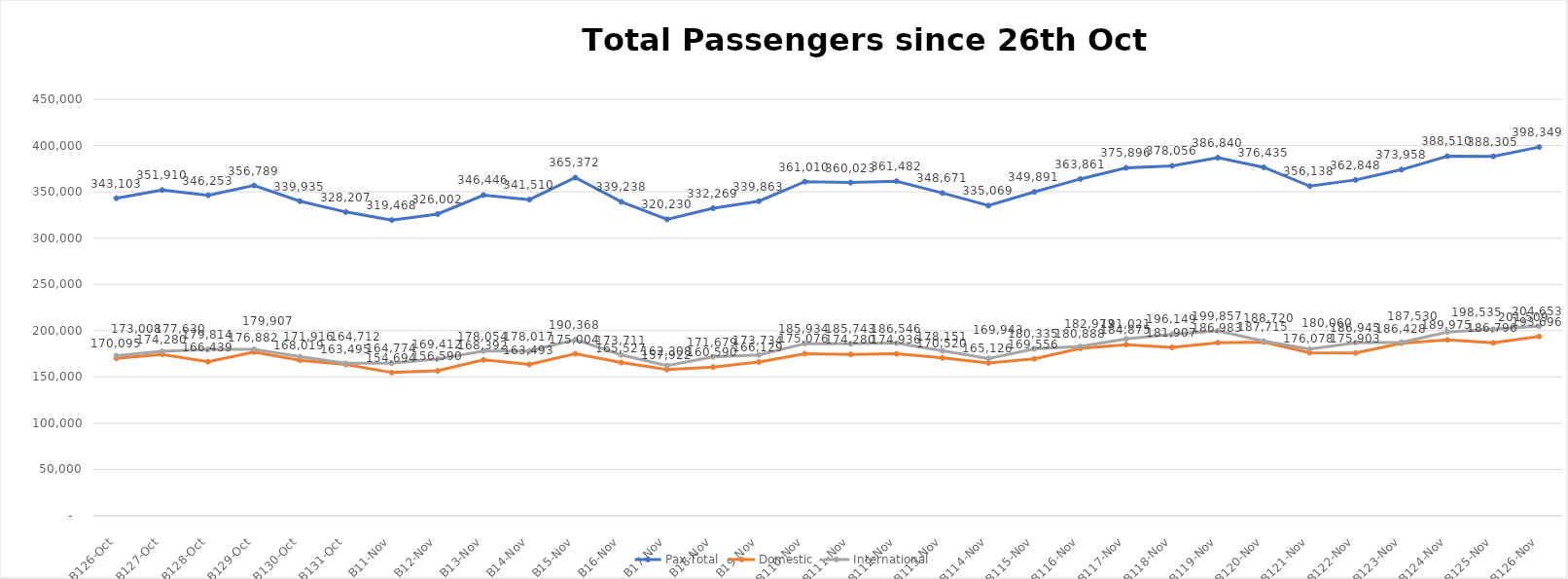
| Category | Pax Total | Domestic | International |
|---|---|---|---|
| 2023-10-26 | 343103 | 170095 | 173008 |
| 2023-10-27 | 351910 | 174280 | 177630 |
| 2023-10-28 | 346253 | 166439 | 179814 |
| 2023-10-29 | 356789 | 176882 | 179907 |
| 2023-10-30 | 339935 | 168019 | 171916 |
| 2023-10-31 | 328207 | 163495 | 164712 |
| 2023-11-01 | 319468 | 154694 | 164774 |
| 2023-11-02 | 326002 | 156590 | 169412 |
| 2023-11-03 | 346446 | 168392 | 178054 |
| 2023-11-04 | 341510 | 163493 | 178017 |
| 2023-11-05 | 365372 | 175004 | 190368 |
| 2023-11-06 | 339238 | 165527 | 173711 |
| 2023-11-07 | 320230 | 157922 | 162308 |
| 2023-11-08 | 332269 | 160590 | 171679 |
| 2023-11-09 | 339863 | 166129 | 173734 |
| 2023-11-10 | 361010 | 175076 | 185934 |
| 2023-11-11 | 360023 | 174280 | 185743 |
| 2023-11-12 | 361482 | 174936 | 186546 |
| 2023-11-13 | 348671 | 170520 | 178151 |
| 2023-11-14 | 335069 | 165126 | 169943 |
| 2023-11-15 | 349891 | 169556 | 180335 |
| 2023-11-16 | 363861 | 180888 | 182973 |
| 2023-11-17 | 375896 | 184875 | 191021 |
| 2023-11-18 | 378056 | 181907 | 196149 |
| 2023-11-19 | 386840 | 186983 | 199857 |
| 2023-11-20 | 376435 | 187715 | 188720 |
| 2023-11-21 | 356138 | 176078 | 180060 |
| 2023-11-22 | 362848 | 175903 | 186945 |
| 2023-11-23 | 373958 | 186428 | 187530 |
| 2023-11-24 | 388510 | 189975 | 198535 |
| 2023-11-25 | 388305 | 186796 | 201509 |
| 2023-11-26 | 398349 | 193696 | 204653 |